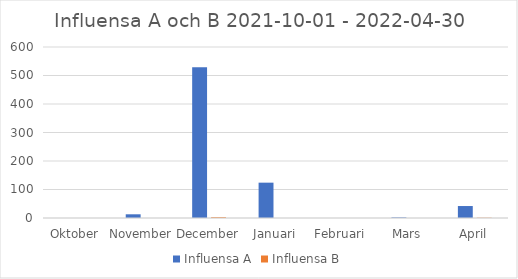
| Category | Influensa A | Influensa B |
|---|---|---|
| Oktober | 0 | 0 |
| November | 13 | 0 |
| December | 529 | 3 |
| Januari | 124 | 0 |
| Februari | 0 | 0 |
| Mars | 2 | 0 |
| April | 42 | 1 |